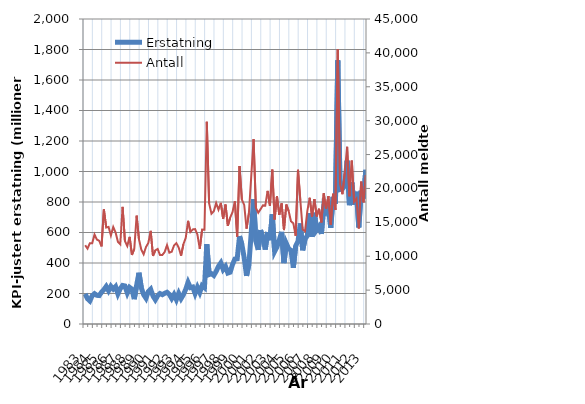
| Category | Erstatning |
|---|---|
| 1983.0 | 197.588 |
| nan | 165.511 |
| nan | 151.359 |
| nan | 185.41 |
| 1984.0 | 198.82 |
| nan | 188.069 |
| nan | 186.467 |
| nan | 208.564 |
| 1985.0 | 225.381 |
| nan | 246.348 |
| nan | 218.294 |
| nan | 247.574 |
| 1986.0 | 229.539 |
| nan | 245.617 |
| nan | 197.688 |
| nan | 231.341 |
| 1987.0 | 252.735 |
| nan | 249.403 |
| nan | 204.097 |
| nan | 240.126 |
| 1988.0 | 228.552 |
| nan | 162.922 |
| nan | 253.756 |
| nan | 336.155 |
| 1989.0 | 237.486 |
| nan | 191.945 |
| nan | 168.896 |
| nan | 213.081 |
| 1990.0 | 228.154 |
| nan | 183.55 |
| nan | 159.187 |
| nan | 185.288 |
| 1991.0 | 199.943 |
| nan | 192.245 |
| nan | 201.197 |
| nan | 208.012 |
| 1992.0 | 194.322 |
| nan | 167.439 |
| nan | 193.471 |
| nan | 159.652 |
| 1993.0 | 200.319 |
| nan | 166.71 |
| nan | 192.604 |
| nan | 227.856 |
| 1994.0 | 272.908 |
| nan | 238.583 |
| nan | 242.398 |
| nan | 199.796 |
| 1995.0 | 240.712 |
| nan | 207.084 |
| nan | 251.629 |
| nan | 238.909 |
| 1996.0 | 523.926 |
| nan | 324.424 |
| nan | 330.22 |
| nan | 318.471 |
| 1997.0 | 344.773 |
| nan | 378.33 |
| nan | 400.656 |
| nan | 357.477 |
| 1998.0 | 377.13 |
| nan | 334.101 |
| nan | 339.56 |
| nan | 390.285 |
| 1999.0 | 425.689 |
| nan | 427.757 |
| nan | 575.602 |
| nan | 521.283 |
| 2000.0 | 434.524 |
| nan | 315.56 |
| nan | 391.205 |
| nan | 596.467 |
| 2001.0 | 818.583 |
| nan | 541.905 |
| nan | 486.703 |
| nan | 615.779 |
| 2002.0 | 560.824 |
| nan | 487.972 |
| nan | 603.049 |
| nan | 549.512 |
| 2003.0 | 718.687 |
| nan | 475.17 |
| nan | 505.52 |
| nan | 550.69 |
| 2004.0 | 604.137 |
| nan | 399.414 |
| nan | 528.042 |
| nan | 493.557 |
| 2005.0 | 483.071 |
| nan | 368.65 |
| nan | 511.786 |
| nan | 542.365 |
| 2006.0 | 659.254 |
| nan | 483.472 |
| nan | 556.294 |
| nan | 580.368 |
| 2007.0 | 726.446 |
| nan | 571.14 |
| nan | 729.727 |
| nan | 616.971 |
| 2008.0 | 638.028 |
| nan | 590.654 |
| nan | 771.428 |
| nan | 740.877 |
| 2009.0 | 777.468 |
| nan | 631.18 |
| nan | 833.772 |
| nan | 788.089 |
| 2010.0 | 1728.747 |
| nan | 881.747 |
| nan | 885.989 |
| nan | 906.404 |
| 2011.0 | 1071.204 |
| nan | 778.954 |
| nan | 928.783 |
| nan | 782.745 |
| 2012.0 | 867.175 |
| nan | 633.984 |
| nan | 874.087 |
| nan | 823.035 |
| 2013.0 | 1010.773 |